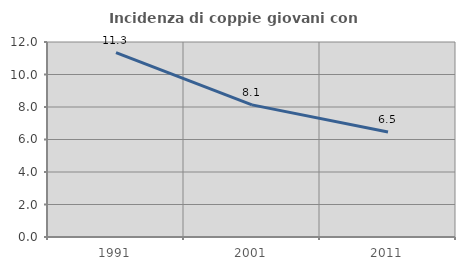
| Category | Incidenza di coppie giovani con figli |
|---|---|
| 1991.0 | 11.345 |
| 2001.0 | 8.131 |
| 2011.0 | 6.465 |